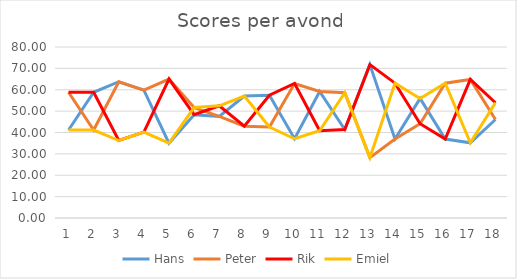
| Category | Hans | Peter | Rik | Emiel |
|---|---|---|---|---|
| 1.0 | 41.17 | 58.83 | 58.83 | 41.17 |
| 2.0 | 58.83 | 41.17 | 58.83 | 41.17 |
| 3.0 | 63.75 | 63.75 | 36.25 | 36.25 |
| 4.0 | 59.83 | 59.83 | 40.17 | 40.17 |
| 5.0 | 35 | 65 | 65 | 35 |
| 6.0 | 48.33 | 51.67 | 48.33 | 51.67 |
| 7.0 | 47.5 | 47.5 | 52.5 | 52.5 |
| 8.0 | 57.08 | 42.92 | 42.92 | 57.08 |
| 9.0 | 57.42 | 42.58 | 57.42 | 42.58 |
| 10.0 | 37.08 | 62.92 | 62.92 | 37.08 |
| 11.0 | 59.17 | 59.17 | 40.83 | 40.83 |
| 12.0 | 41.42 | 58.58 | 41.42 | 58.58 |
| 13.0 | 71.75 | 28.25 | 71.75 | 28.25 |
| 14.0 | 36.92 | 36.92 | 63.08 | 63.08 |
| 15.0 | 55.92 | 44.08 | 44.08 | 55.92 |
| 16.0 | 36.92 | 63.08 | 36.92 | 63.08 |
| 17.0 | 35.17 | 64.83 | 64.83 | 35.17 |
| 18.0 | 46.08 | 46.08 | 53.92 | 53.92 |